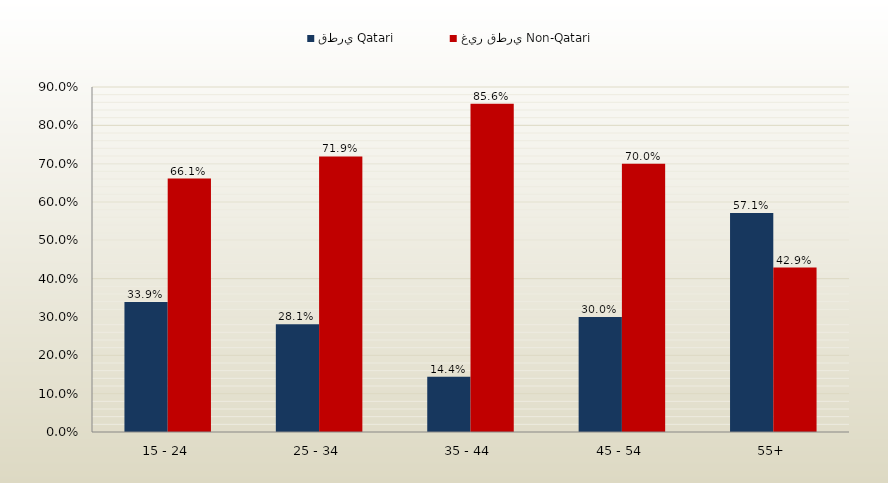
| Category | قطري Qatari | غير قطري Non-Qatari |
|---|---|---|
| 15 - 24 | 0.339 | 0.661 |
| 25 - 34 | 0.281 | 0.719 |
| 35 - 44 | 0.144 | 0.856 |
| 45 - 54 | 0.3 | 0.7 |
| 55+ | 0.571 | 0.429 |